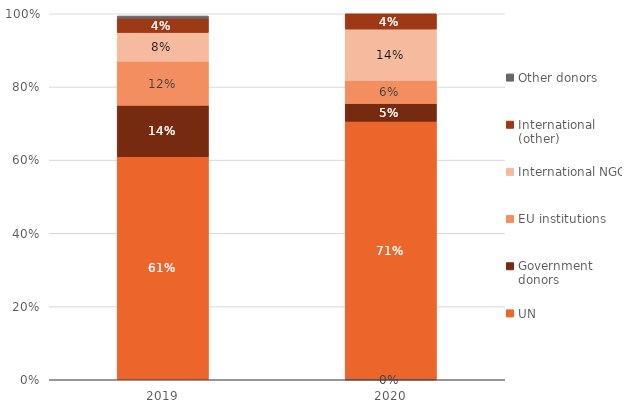
| Category | UN | Government donors | EU institutions | International NGOs | International (other) | Other donors |
|---|---|---|---|---|---|---|
| 2019.0 | 0.609 | 0.14 | 0.12 | 0.079 | 0.039 | 0.006 |
| 2020.0 | 0.706 | 0.049 | 0.063 | 0.141 | 0.042 | 0 |